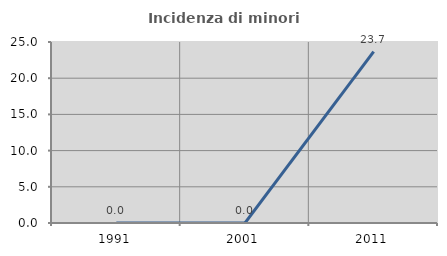
| Category | Incidenza di minori stranieri |
|---|---|
| 1991.0 | 0 |
| 2001.0 | 0 |
| 2011.0 | 23.684 |